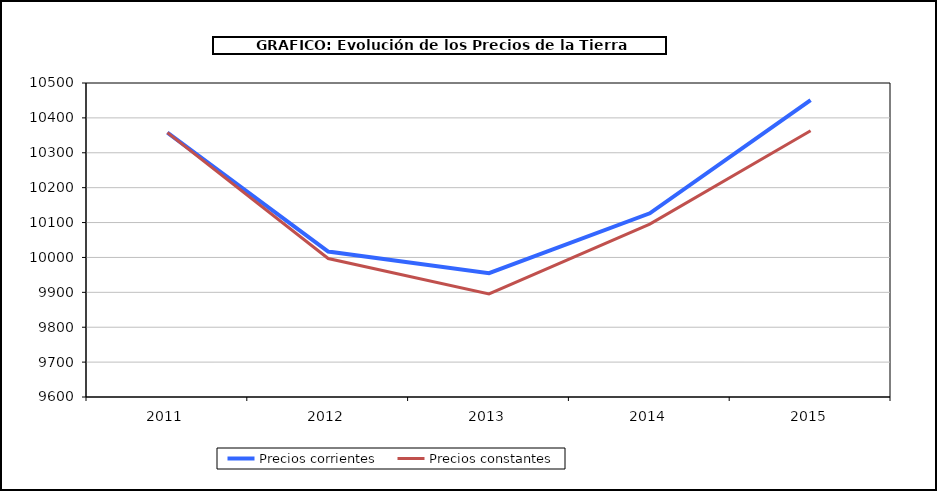
| Category | Precios corrientes | Precios constantes |
|---|---|---|
| 2011.0 | 10357.792 | 10357.792 |
| 2012.0 | 10016.851 | 9996.858 |
| 2013.0 | 9954.811 | 9895.36 |
| 2014.0 | 10126.573 | 10095.601 |
| 2015.0 | 10451.228 | 10363.273 |